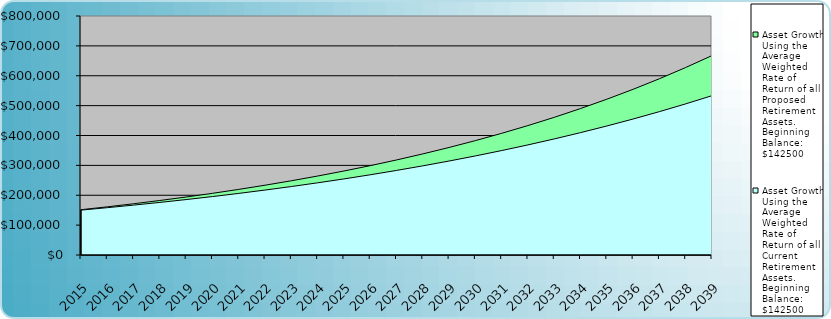
| Category | Asset Growth Using the Average Weighted Rate of Return of all Proposed Retirement Assets. Beginning Balance: $142500 | Asset Growth Using the Average Weighted Rate of Return of all Current Retirement Assets. Beginning Balance: $142500 |
|---|---|---|
| 2015.0 | 151580 | 150225 |
| 2016.0 | 161238.571 | 158368.776 |
| 2017.0 | 171512.58 | 166954.031 |
| 2018.0 | 182441.241 | 176004.697 |
| 2019.0 | 194066.269 | 185546.004 |
| 2020.0 | 206432.035 | 195604.551 |
| 2021.0 | 219585.74 | 206208.376 |
| 2022.0 | 233577.589 | 217387.041 |
| 2023.0 | 248460.989 | 229171.707 |
| 2024.0 | 264292.749 | 241595.226 |
| 2025.0 | 281133.297 | 254692.23 |
| 2026.0 | 299046.914 | 268499.23 |
| 2027.0 | 318101.973 | 283054.714 |
| 2028.0 | 338371.208 | 298399.26 |
| 2029.0 | 359931.984 | 314575.64 |
| 2030.0 | 382866.597 | 331628.951 |
| 2031.0 | 407262.588 | 349606.731 |
| 2032.0 | 433213.074 | 368559.096 |
| 2033.0 | 460817.108 | 388538.879 |
| 2034.0 | 490180.05 | 409601.776 |
| 2035.0 | 521413.979 | 431806.504 |
| 2036.0 | 554638.112 | 455214.962 |
| 2037.0 | 589979.263 | 479892.404 |
| 2038.0 | 627572.328 | 505907.624 |
| 2039.0 | 667560.796 | 533333.143 |